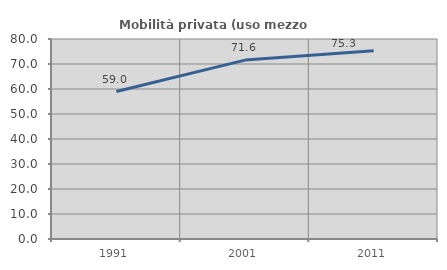
| Category | Mobilità privata (uso mezzo privato) |
|---|---|
| 1991.0 | 58.986 |
| 2001.0 | 71.557 |
| 2011.0 | 75.293 |